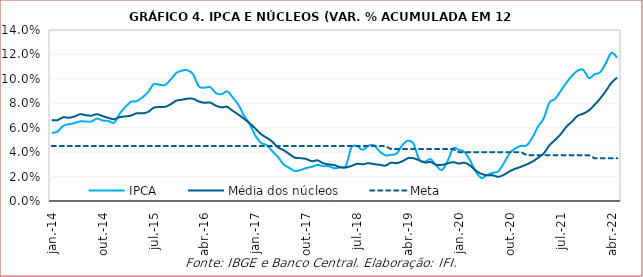
| Category | IPCA | Média dos núcleos | Meta |
|---|---|---|---|
| 2014-01-01 | 0.056 | 0.066 | 0.045 |
| 2014-02-01 | 0.057 | 0.066 | 0.045 |
| 2014-03-01 | 0.062 | 0.069 | 0.045 |
| 2014-04-01 | 0.063 | 0.068 | 0.045 |
| 2014-05-01 | 0.064 | 0.069 | 0.045 |
| 2014-06-01 | 0.065 | 0.071 | 0.045 |
| 2014-07-01 | 0.065 | 0.07 | 0.045 |
| 2014-08-01 | 0.065 | 0.07 | 0.045 |
| 2014-09-01 | 0.067 | 0.071 | 0.045 |
| 2014-10-01 | 0.066 | 0.07 | 0.045 |
| 2014-11-01 | 0.066 | 0.068 | 0.045 |
| 2014-12-01 | 0.064 | 0.067 | 0.045 |
| 2015-01-01 | 0.071 | 0.069 | 0.045 |
| 2015-02-01 | 0.077 | 0.069 | 0.045 |
| 2015-03-01 | 0.081 | 0.07 | 0.045 |
| 2015-04-01 | 0.082 | 0.072 | 0.045 |
| 2015-05-01 | 0.085 | 0.072 | 0.045 |
| 2015-06-01 | 0.089 | 0.073 | 0.045 |
| 2015-07-01 | 0.096 | 0.076 | 0.045 |
| 2015-08-01 | 0.095 | 0.077 | 0.045 |
| 2015-09-01 | 0.095 | 0.077 | 0.045 |
| 2015-10-01 | 0.099 | 0.079 | 0.045 |
| 2015-11-01 | 0.105 | 0.082 | 0.045 |
| 2015-12-01 | 0.107 | 0.083 | 0.045 |
| 2016-01-01 | 0.107 | 0.084 | 0.045 |
| 2016-02-01 | 0.104 | 0.084 | 0.045 |
| 2016-03-01 | 0.094 | 0.081 | 0.045 |
| 2016-04-01 | 0.093 | 0.08 | 0.045 |
| 2016-05-01 | 0.093 | 0.081 | 0.045 |
| 2016-06-01 | 0.088 | 0.078 | 0.045 |
| 2016-07-01 | 0.087 | 0.077 | 0.045 |
| 2016-08-01 | 0.09 | 0.077 | 0.045 |
| 2016-09-01 | 0.085 | 0.074 | 0.045 |
| 2016-10-01 | 0.079 | 0.071 | 0.045 |
| 2016-11-01 | 0.07 | 0.067 | 0.045 |
| 2016-12-01 | 0.063 | 0.064 | 0.045 |
| 2017-01-01 | 0.054 | 0.059 | 0.045 |
| 2017-02-01 | 0.048 | 0.055 | 0.045 |
| 2017-03-01 | 0.046 | 0.052 | 0.045 |
| 2017-04-01 | 0.041 | 0.049 | 0.045 |
| 2017-05-01 | 0.036 | 0.044 | 0.045 |
| 2017-06-01 | 0.03 | 0.042 | 0.045 |
| 2017-07-01 | 0.027 | 0.038 | 0.045 |
| 2017-08-01 | 0.025 | 0.035 | 0.045 |
| 2017-09-01 | 0.025 | 0.035 | 0.045 |
| 2017-10-01 | 0.027 | 0.034 | 0.045 |
| 2017-11-01 | 0.028 | 0.033 | 0.045 |
| 2017-12-01 | 0.029 | 0.033 | 0.045 |
| 2018-01-01 | 0.029 | 0.031 | 0.045 |
| 2018-02-01 | 0.028 | 0.03 | 0.045 |
| 2018-03-01 | 0.027 | 0.029 | 0.045 |
| 2018-04-01 | 0.028 | 0.028 | 0.045 |
| 2018-05-01 | 0.029 | 0.027 | 0.045 |
| 2018-06-01 | 0.044 | 0.029 | 0.045 |
| 2018-07-01 | 0.045 | 0.03 | 0.045 |
| 2018-08-01 | 0.042 | 0.03 | 0.045 |
| 2018-09-01 | 0.045 | 0.031 | 0.045 |
| 2018-10-01 | 0.046 | 0.03 | 0.045 |
| 2018-11-01 | 0.04 | 0.03 | 0.045 |
| 2018-12-01 | 0.037 | 0.029 | 0.045 |
| 2019-01-01 | 0.038 | 0.031 | 0.042 |
| 2019-02-01 | 0.039 | 0.031 | 0.042 |
| 2019-03-01 | 0.046 | 0.032 | 0.042 |
| 2019-04-01 | 0.049 | 0.035 | 0.042 |
| 2019-05-01 | 0.047 | 0.035 | 0.042 |
| 2019-06-01 | 0.034 | 0.033 | 0.042 |
| 2019-07-01 | 0.032 | 0.032 | 0.042 |
| 2019-08-01 | 0.034 | 0.032 | 0.042 |
| 2019-09-01 | 0.029 | 0.03 | 0.042 |
| 2019-10-01 | 0.025 | 0.03 | 0.042 |
| 2019-11-01 | 0.033 | 0.031 | 0.042 |
| 2019-12-01 | 0.043 | 0.032 | 0.042 |
| 2020-01-01 | 0.042 | 0.031 | 0.04 |
| 2020-02-01 | 0.04 | 0.031 | 0.04 |
| 2020-03-01 | 0.033 | 0.029 | 0.04 |
| 2020-04-01 | 0.024 | 0.025 | 0.04 |
| 2020-05-01 | 0.019 | 0.022 | 0.04 |
| 2020-06-01 | 0.021 | 0.021 | 0.04 |
| 2020-07-01 | 0.023 | 0.021 | 0.04 |
| 2020-08-01 | 0.024 | 0.02 | 0.04 |
| 2020-09-01 | 0.031 | 0.022 | 0.04 |
| 2020-10-01 | 0.039 | 0.024 | 0.04 |
| 2020-11-01 | 0.043 | 0.026 | 0.04 |
| 2020-12-01 | 0.045 | 0.028 | 0.04 |
| 2021-01-01 | 0.046 | 0.03 | 0.038 |
| 2021-02-01 | 0.052 | 0.032 | 0.038 |
| 2021-03-01 | 0.061 | 0.035 | 0.038 |
| 2021-04-01 | 0.068 | 0.039 | 0.038 |
| 2021-05-01 | 0.081 | 0.045 | 0.038 |
| 2021-06-01 | 0.083 | 0.05 | 0.038 |
| 2021-07-01 | 0.09 | 0.055 | 0.038 |
| 2021-08-01 | 0.097 | 0.061 | 0.038 |
| 2021-09-01 | 0.102 | 0.065 | 0.038 |
| 2021-10-01 | 0.107 | 0.07 | 0.038 |
| 2021-11-01 | 0.107 | 0.072 | 0.038 |
| 2021-12-01 | 0.101 | 0.074 | 0.038 |
| 2022-01-01 | 0.104 | 0.079 | 0.035 |
| 2022-02-01 | 0.105 | 0.084 | 0.035 |
| 2022-03-01 | 0.113 | 0.09 | 0.035 |
| 2022-04-01 | 0.121 | 0.097 | 0.035 |
| 2022-05-01 | 0.117 | 0.101 | 0.035 |